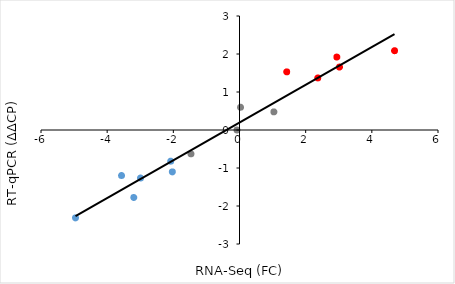
| Category | Series 0 |
|---|---|
| -0.075386114 | 0 |
| -4.957387 | -2.313 |
| 0.031330176 | 0.6 |
| -3.194495 | -1.777 |
| 2.365003 | 1.37 |
| -2.0796888 | -0.82 |
| 2.9437926 | 1.92 |
| -2.992287 | -1.263 |
| 1.4263849 | 1.53 |
| -2.0303512 | -1.103 |
| 4.6851015 | 2.087 |
| -3.565607 | -1.197 |
| 3.0240307 | 1.657 |
| -1.4666221 | -0.627 |
| 1.0408678 | 0.477 |